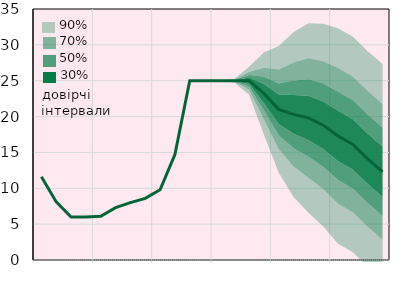
| Category | Облікова ставка, % |
|---|---|
|  | 11.6 |
|  | 8.1 |
|  | 6 |
| IV.20 | 6 |
|  | 6.1 |
|  | 7.3 |
|  | 8 |
| IV.21 | 8.6 |
|  | 9.8 |
|  | 14.7 |
|  | 25 |
| IV.22 | 25 |
|  | 25 |
|  | 25 |
|  | 25 |
| IV.23 | 23.2 |
|  | 21 |
|  | 20.3 |
|  | 19.8 |
| IV.24 | 18.8 |
|  | 17.3 |
|  | 16.1 |
|  | 14.1 |
| IV.25 | 12.3 |